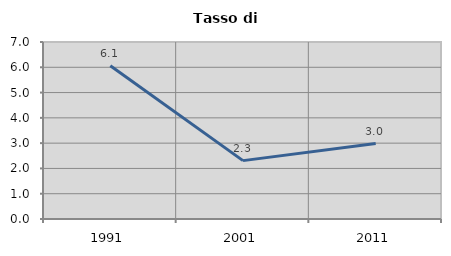
| Category | Tasso di disoccupazione   |
|---|---|
| 1991.0 | 6.061 |
| 2001.0 | 2.309 |
| 2011.0 | 2.983 |